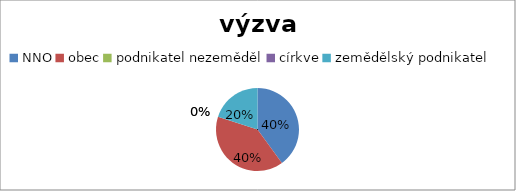
| Category | Series 0 |
|---|---|
| NNO | 2 |
| obec | 2 |
| podnikatel nezeměděl | 0 |
| církve | 0 |
| zemědělský podnikatel | 1 |